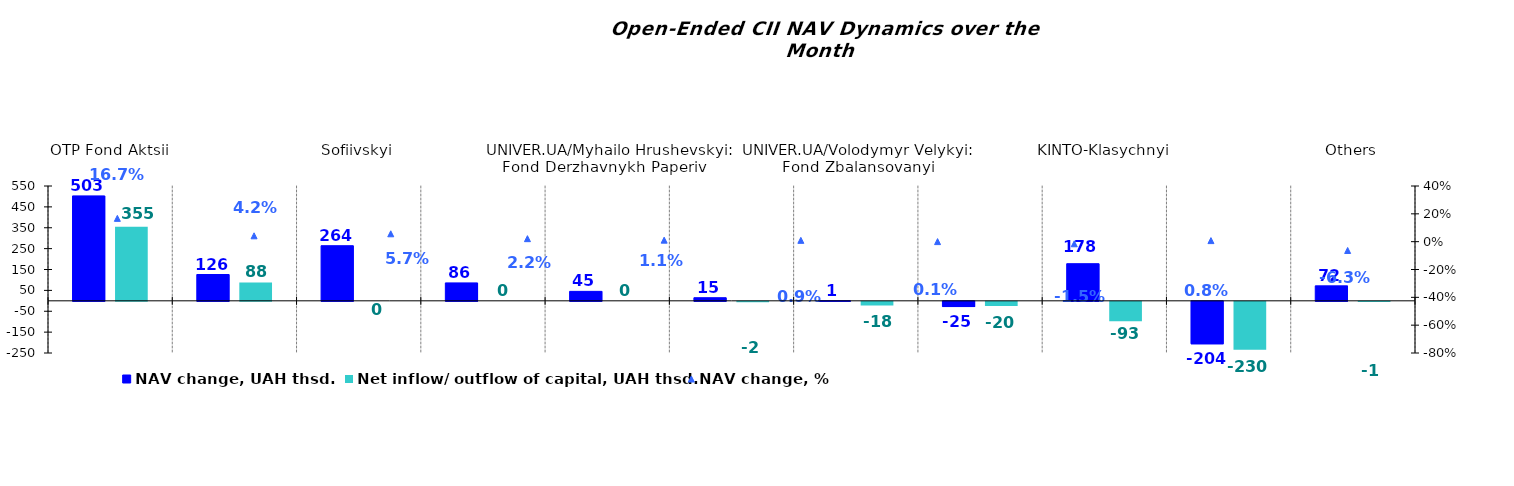
| Category | NAV change, UAH thsd. | Net inflow/ outflow of capital, UAH thsd. |
|---|---|---|
| ОТP Fond Aktsii | 502.567 | 354.737 |
| ОТP Klasychnyi | 126.036 | 87.5 |
| Sofiivskyi | 263.943 | 0 |
| KINTO-Ekviti | 85.821 | 0 |
| UNIVER.UA/Myhailo Hrushevskyi: Fond Derzhavnykh Paperiv    | 45.256 | 0 |
| KINTO- Kaznacheiskyi | 14.845 | -1.741 |
| UNIVER.UA/Volodymyr Velykyi: Fond Zbalansovanyi | 0.601 | -17.593 |
| VSI | -25.211 | -19.706 |
| KINTO-Klasychnyi | 177.83 | -92.928 |
| UNIVER.UA/Taras Shevchenko: Fond Zaoshchadzhen | -203.554 | -229.692 |
| Others | 71.566 | -0.557 |